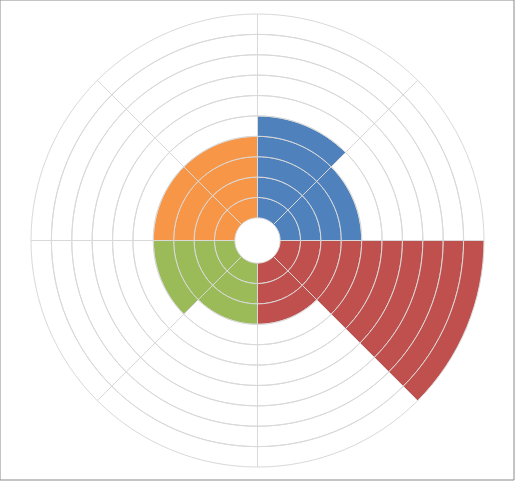
| Category | Series 0 | Series 1 | Series 2 | Series 3 | Series 4 | Series 5 | Series 6 | Series 7 | Series 8 | Series 9 |
|---|---|---|---|---|---|---|---|---|---|---|
| 0 | 10 | 10 | 10 | 10 | 10 | 0 | 0 | 0 | 0 | 0 |
| 1 | 0 | 0 | 0 | 0 | 0 | 10 | 10 | 10 | 10 | 10 |
| 2 | 10 | 10 | 10 | 10 | 0 | 0 | 0 | 0 | 0 | 0 |
| 3 | 0 | 0 | 0 | 0 | 10 | 10 | 10 | 10 | 10 | 10 |
| 4 | 10 | 10 | 10 | 10 | 10 | 10 | 10 | 10 | 10 | 10 |
| 5 | 0 | 0 | 0 | 0 | 0 | 0 | 0 | 0 | 0 | 0 |
| 6 | 10 | 10 | 10 | 0 | 0 | 0 | 0 | 0 | 0 | 0 |
| 7 | 0 | 0 | 0 | 10 | 10 | 10 | 10 | 10 | 10 | 10 |
| 8 | 10 | 10 | 10 | 0 | 0 | 0 | 0 | 0 | 0 | 0 |
| 9 | 0 | 0 | 0 | 10 | 10 | 10 | 10 | 10 | 10 | 10 |
| 10 | 10 | 10 | 10 | 10 | 0 | 0 | 0 | 0 | 0 | 0 |
| 11 | 0 | 0 | 0 | 0 | 10 | 10 | 10 | 10 | 10 | 10 |
| 12 | 10 | 10 | 10 | 10 | 0 | 0 | 0 | 0 | 0 | 0 |
| 13 | 0 | 0 | 0 | 0 | 10 | 10 | 10 | 10 | 10 | 10 |
| 14 | 10 | 10 | 10 | 10 | 0 | 0 | 0 | 0 | 0 | 0 |
| 15 | 0 | 0 | 0 | 0 | 10 | 10 | 10 | 10 | 10 | 10 |